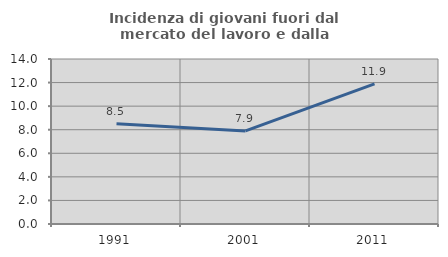
| Category | Incidenza di giovani fuori dal mercato del lavoro e dalla formazione  |
|---|---|
| 1991.0 | 8.511 |
| 2001.0 | 7.895 |
| 2011.0 | 11.888 |